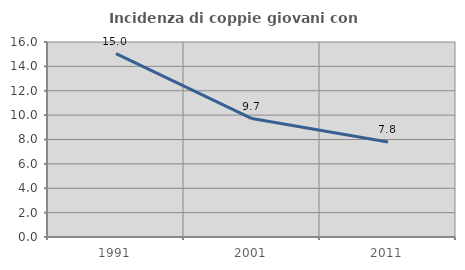
| Category | Incidenza di coppie giovani con figli |
|---|---|
| 1991.0 | 15.04 |
| 2001.0 | 9.721 |
| 2011.0 | 7.801 |